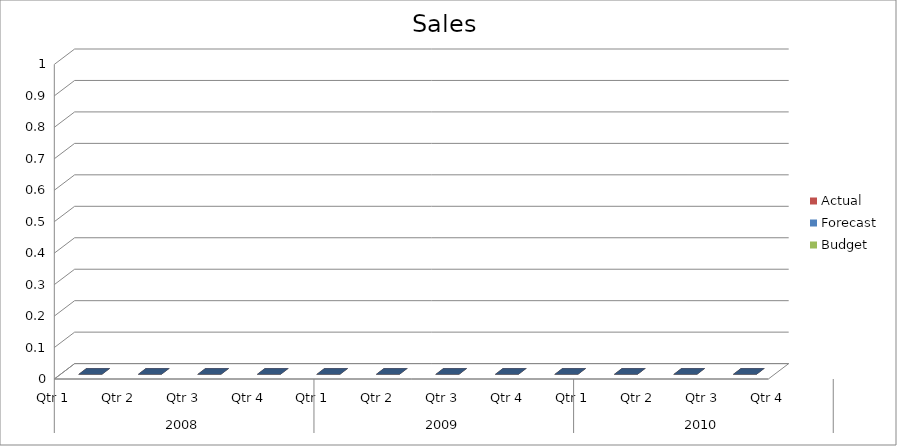
| Category | Budget | Forecast | Actual |
|---|---|---|---|
| 0 | 1360 | 3500 | 3420 |
| 1 | 1850 | 560 | 1690 |
| 2 | 1230 | 1980 | 850 |
| 3 | 1150 | 2920 | 2050 |
| 4 | 520 | 2800 | 1570 |
| 5 | 1340 | 1930 | 3100 |
| 6 | 3500 | 3160 | 2050 |
| 7 | 1550 | 540 | 720 |
| 8 | 3460 | 3090 | 2290 |
| 9 | 610 | 1500 | 2890 |
| 10 | 1370 | 1000 | 2100 |
| 11 | 2260 | 3180 | 1140 |